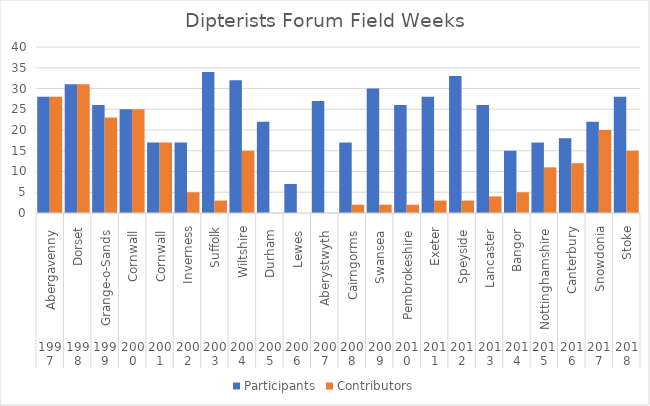
| Category | Participants | Contributors |
|---|---|---|
| 0 | 28 | 28 |
| 1 | 31 | 31 |
| 2 | 26 | 23 |
| 3 | 25 | 25 |
| 4 | 17 | 17 |
| 5 | 17 | 5 |
| 6 | 34 | 3 |
| 7 | 32 | 15 |
| 8 | 22 | 0 |
| 9 | 7 | 0 |
| 10 | 27 | 0 |
| 11 | 17 | 2 |
| 12 | 30 | 2 |
| 13 | 26 | 2 |
| 14 | 28 | 3 |
| 15 | 33 | 3 |
| 16 | 26 | 4 |
| 17 | 15 | 5 |
| 18 | 17 | 11 |
| 19 | 18 | 12 |
| 20 | 22 | 20 |
| 21 | 28 | 15 |